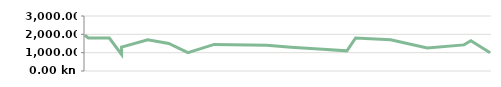
| Category | PRIHOD |
|---|---|
| 2013-04-23 | 1950 |
| 2013-04-25 | 1800 |
| 2013-05-07 | 1800 |
| 2013-05-14 | 900 |
| 2013-05-14 | 1300 |
| 2013-05-29 | 1700 |
| 2013-06-10 | 1500 |
| 2013-06-21 | 1000 |
| 2013-07-06 | 1450 |
| 2013-08-05 | 1400 |
| 2013-08-19 | 1300 |
| 2013-09-04 | 1200 |
| 2013-09-20 | 1100 |
| 2013-09-25 | 1800 |
| 2013-10-15 | 1700 |
| 2013-11-05 | 1250 |
| 2013-11-26 | 1425 |
| 2013-11-30 | 1650 |
| 2013-12-11 | 1000 |